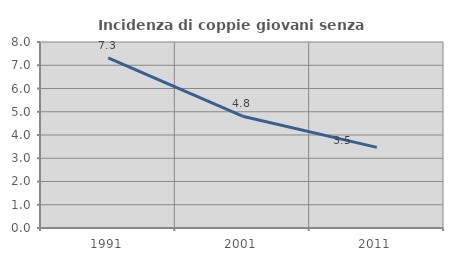
| Category | Incidenza di coppie giovani senza figli |
|---|---|
| 1991.0 | 7.32 |
| 2001.0 | 4.809 |
| 2011.0 | 3.468 |